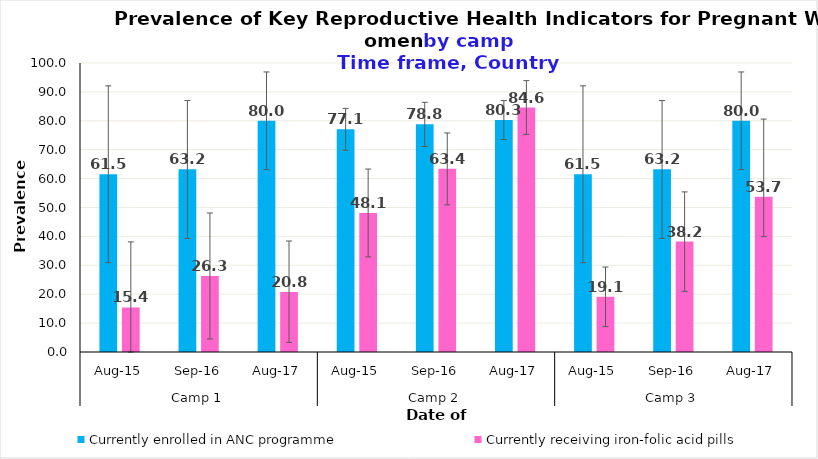
| Category | Currently enrolled in ANC programme | Currently receiving iron-folic acid pills |
|---|---|---|
| 0 | 61.5 | 15.4 |
| 1 | 63.2 | 26.3 |
| 2 | 80 | 20.8 |
| 3 | 77.1 | 48.1 |
| 4 | 78.8 | 63.4 |
| 5 | 80.3 | 84.6 |
| 6 | 61.5 | 19.1 |
| 7 | 63.2 | 38.2 |
| 8 | 80 | 53.7 |